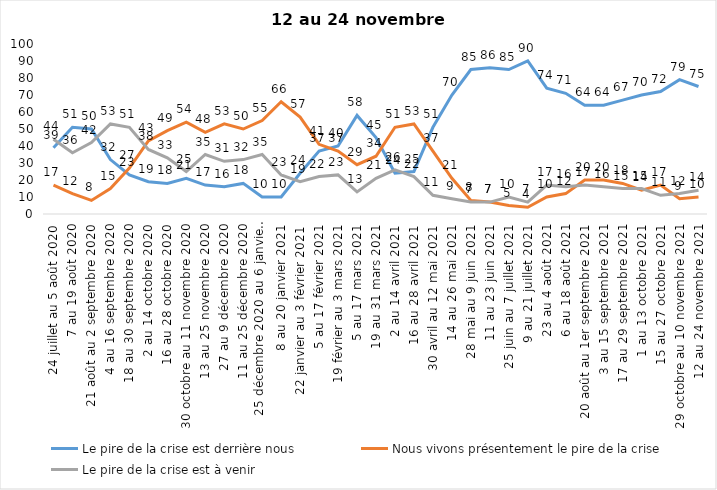
| Category | Le pire de la crise est derrière nous | Nous vivons présentement le pire de la crise | Le pire de la crise est à venir |
|---|---|---|---|
| 24 juillet au 5 août 2020 | 39 | 17 | 44 |
| 7 au 19 août 2020 | 51 | 12 | 36 |
| 21 août au 2 septembre 2020 | 50 | 8 | 42 |
| 4 au 16 septembre 2020 | 32 | 15 | 53 |
| 18 au 30 septembre 2020 | 23 | 27 | 51 |
| 2 au 14 octobre 2020 | 19 | 43 | 38 |
| 16 au 28 octobre 2020 | 18 | 49 | 33 |
| 30 octobre au 11 novembre 2020 | 21 | 54 | 25 |
| 13 au 25 novembre 2020 | 17 | 48 | 35 |
| 27 au 9 décembre 2020 | 16 | 53 | 31 |
| 11 au 25 décembre 2020 | 18 | 50 | 32 |
| 25 décembre 2020 au 6 janvier 2021 | 10 | 55 | 35 |
| 8 au 20 janvier 2021 | 10 | 66 | 23 |
| 22 janvier au 3 février 2021 | 24 | 57 | 19 |
| 5 au 17 février 2021 | 37 | 41 | 22 |
| 19 février au 3 mars 2021 | 40 | 37 | 23 |
| 5 au 17 mars 2021 | 58 | 29 | 13 |
| 19 au 31 mars 2021 | 45 | 34 | 21 |
| 2 au 14 avril 2021 | 24 | 51 | 26 |
| 16 au 28 avril 2021 | 25 | 53 | 22 |
| 30 avril au 12 mai 2021 | 51 | 37 | 11 |
| 14 au 26 mai 2021 | 70 | 21 | 9 |
| 28 mai au 9 juin 2021 | 85 | 8 | 7 |
| 11 au 23 juin 2021 | 86 | 7 | 7 |
| 25 juin au 7 juillet 2021 | 85 | 5 | 10 |
| 9 au 21 juillet 2021 | 90 | 4 | 7 |
| 23 au 4 août 2021 | 74 | 10 | 17 |
| 6 au 18 août 2021 | 71 | 12 | 16 |
| 20 août au 1er septembre 2021 | 64 | 20 | 17 |
| 3 au 15 septembre 2021 | 64 | 20 | 16 |
| 17 au 29 septembre 2021 | 67 | 18 | 15 |
| 1 au 13 octobre 2021 | 70 | 14 | 15 |
| 15 au 27 octobre 2021 | 72 | 17 | 11 |
| 29 octobre au 10 novembre 2021 | 79 | 9 | 12 |
| 12 au 24 novembre 2021 | 75 | 10 | 14 |